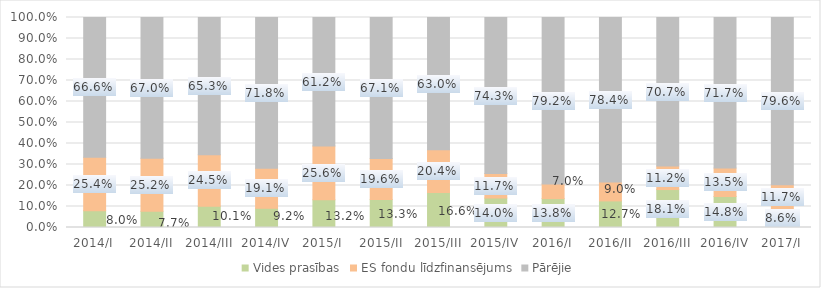
| Category | Vides prasības | ES fondu līdzfinansējums | Pārējie |
|---|---|---|---|
| 2014/I | 0.08 | 0.254 | 0.666 |
| 2014/II | 0.077 | 0.252 | 0.67 |
| 2014/III | 0.101 | 0.245 | 0.653 |
| 2014/IV | 0.092 | 0.191 | 0.718 |
| 2015/I | 0.132 | 0.256 | 0.612 |
| 2015/II | 0.133 | 0.196 | 0.671 |
| 2015/III | 0.166 | 0.204 | 0.63 |
| 2015/IV | 0.14 | 0.117 | 0.743 |
| 2016/I | 0.138 | 0.07 | 0.792 |
| 2016/II | 0.127 | 0.09 | 0.784 |
| 2016/III | 0.181 | 0.112 | 0.707 |
| 2016/IV | 0.148 | 0.135 | 0.717 |
| 2017/I | 0.086 | 0.117 | 0.796 |